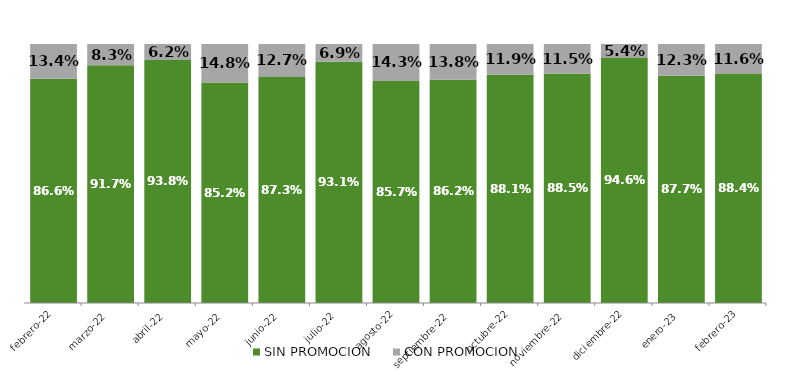
| Category | SIN PROMOCION   | CON PROMOCION   |
|---|---|---|
| 2022-02-01 | 0.866 | 0.134 |
| 2022-03-01 | 0.917 | 0.083 |
| 2022-04-01 | 0.938 | 0.062 |
| 2022-05-01 | 0.852 | 0.148 |
| 2022-06-01 | 0.873 | 0.127 |
| 2022-07-01 | 0.931 | 0.069 |
| 2022-08-01 | 0.857 | 0.143 |
| 2022-09-01 | 0.862 | 0.138 |
| 2022-10-01 | 0.881 | 0.119 |
| 2022-11-01 | 0.885 | 0.115 |
| 2022-12-01 | 0.946 | 0.054 |
| 2023-01-01 | 0.877 | 0.123 |
| 2023-02-01 | 0.884 | 0.116 |